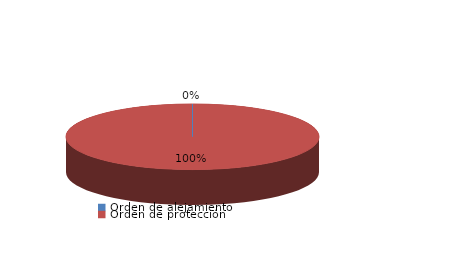
| Category | Series 0 |
|---|---|
| Orden de alejamiento | 0 |
| Orden de protección | 1 |